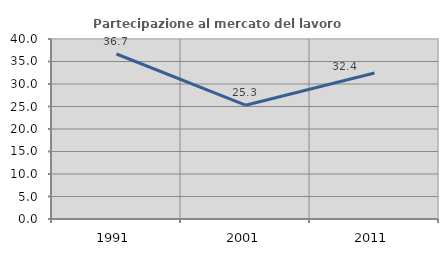
| Category | Partecipazione al mercato del lavoro  femminile |
|---|---|
| 1991.0 | 36.667 |
| 2001.0 | 25.287 |
| 2011.0 | 32.432 |